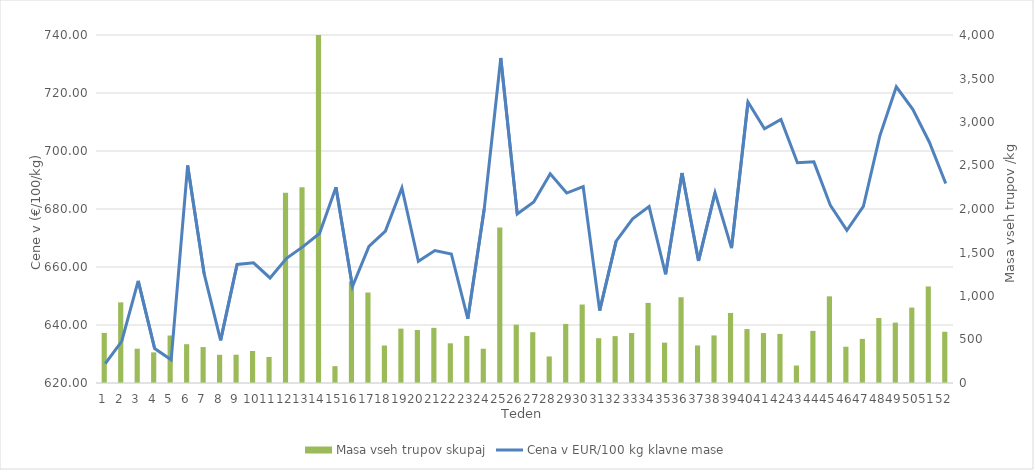
| Category | Masa vseh trupov skupaj |
|---|---|
| 0 | 576 |
| 1 | 927 |
| 2 | 394 |
| 3 | 352 |
| 4 | 546 |
| 5 | 446 |
| 6 | 413 |
| 7 | 324 |
| 8 | 325 |
| 9 | 368 |
| 10 | 299 |
| 11 | 2186 |
| 12 | 2249 |
| 13 | 4022 |
| 14 | 194 |
| 15 | 1170 |
| 16 | 1040 |
| 17 | 431 |
| 18 | 625 |
| 19 | 609 |
| 20 | 634 |
| 21 | 456 |
| 22 | 541 |
| 23 | 394 |
| 24 | 1788 |
| 25 | 670 |
| 26 | 584 |
| 27 | 305 |
| 28 | 679 |
| 29 | 902 |
| 30 | 515 |
| 31 | 539 |
| 32 | 575 |
| 33 | 921 |
| 34 | 464 |
| 35 | 986 |
| 36 | 432 |
| 37 | 547 |
| 38 | 805 |
| 39 | 620 |
| 40 | 574 |
| 41 | 564 |
| 42 | 201 |
| 43 | 599 |
| 44 | 996 |
| 45 | 417 |
| 46 | 507 |
| 47 | 747 |
| 48 | 694 |
| 49 | 867 |
| 50 | 1110 |
| 51 | 589 |